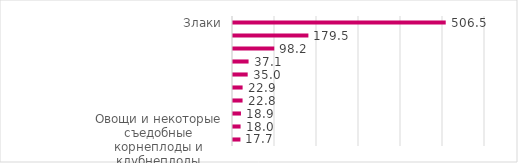
| Category | Изменение доходов (млрд руб) |
|---|---|
| Овощи и некоторые съедобные корнеплоды и клубнеплоды​ | 17.667 |
| Готовые продукты из зерна злаков, муки, крахмала или молока; мучные кондитерские изделия | 18.024 |
| Какао и продукты из него | 18.927 |
| Разные пищевые продукты | 22.76 |
| Мясо и пищевые мясные субпродукты | 22.868 |
| Остатки и отходы пищевой промышленности; готовые корма для животных | 34.966 |
| Масличные семена и плоды; прочие семена, плоды и зерно; лекарственные растения и растения для технических целей; солома и фураж | 37.07 |
| Жиры и масла животного или растительного происхождения и продукты их расщепления; готовые пищевые жиры; воски животного или растительного происхождения | 98.237 |
| Рыба и ракообразные, моллюски и прочие водные беспозвоночные​ | 179.512 |
| Злаки | 506.486 |